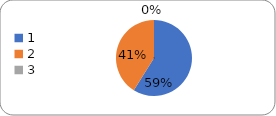
| Category | Series 0 |
|---|---|
| 0 | 66 |
| 1 | 46 |
| 2 | 0 |